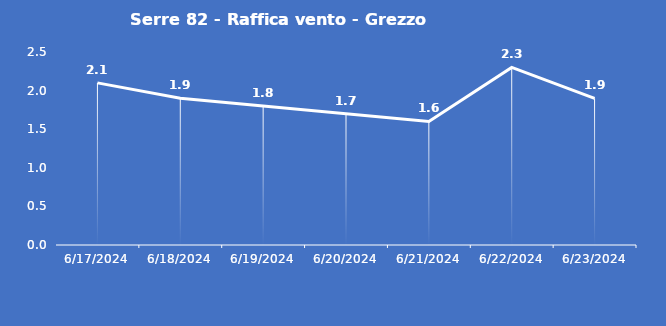
| Category | Serre 82 - Raffica vento - Grezzo (m/s) |
|---|---|
| 6/17/24 | 2.1 |
| 6/18/24 | 1.9 |
| 6/19/24 | 1.8 |
| 6/20/24 | 1.7 |
| 6/21/24 | 1.6 |
| 6/22/24 | 2.3 |
| 6/23/24 | 1.9 |